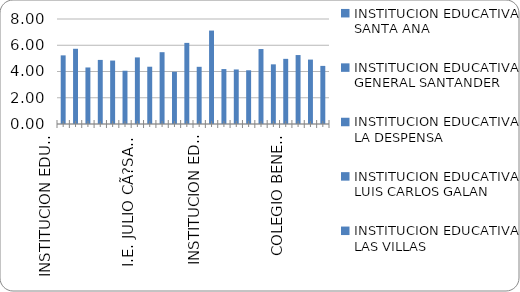
| Category | ISCE 2018 Primaria |
|---|---|
| INSTITUCION EDUCATIVA SANTA ANA | 5.23 |
| INSTITUCION EDUCATIVA GENERAL SANTANDER | 5.731 |
| INSTITUCION EDUCATIVA LA DESPENSA | 4.307 |
| INSTITUCION EDUCATIVA LUIS CARLOS GALAN | 4.883 |
| INSTITUCION EDUCATIVA LAS VILLAS | 4.834 |
| INSTITUCION EDUCATIVA INTEGRADO DE SOACHA | 4.058 |
| I.E. JULIO CÃ?SAR TURBAY AYALA | 5.074 |
| INSTITUCION EDUCATIVA EDUARDO SANTOS | 4.364 |
| INSTITUCION EDUCATIVA CIUDAD LATINA | 5.471 |
| INSTITUCION EDUCATIVA CIUDADELA  SUCRE | 3.979 |
| INSTITUCION EDUCATIVA CAZUCA | 6.18 |
| INSTITUCION EDUCATIVA EL BOSQUE | 4.357 |
| INSTITUCION EDUCATIVA  SAN MATEO | 7.119 |
| INSTITUCION EDUCATIVA GABRIEL GARCIA MARQUEZ | 4.186 |
| INSTITUCION EDUCATIVA BUENOS AIRES | 4.155 |
| INSTITUCION EDUCATIVA COMPARTIR | 4.094 |
| INSTITUCION EDUCATIVA LEON XIII | 5.712 |
| INSTITUCION EDUCATIVA  NUEVO COMPARTIR | 4.546 |
| COLEGIO BENEDICTO XVI | 4.964 |
| INSTITUCION EDUCATIVA MANUELA BELTRAN | 5.253 |
| INSITITUCION EDUCATIVA EUGENIO DIAZ CASTRO | 4.908 |
| INSTITUCION EDUCATIVA  RICAURTE | 4.427 |